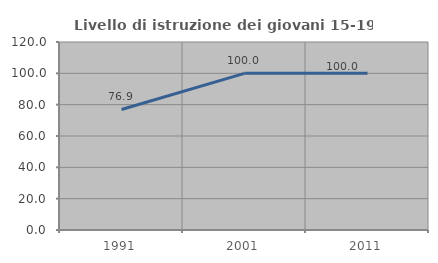
| Category | Livello di istruzione dei giovani 15-19 anni |
|---|---|
| 1991.0 | 76.923 |
| 2001.0 | 100 |
| 2011.0 | 100 |